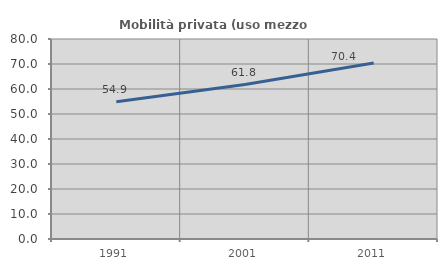
| Category | Mobilità privata (uso mezzo privato) |
|---|---|
| 1991.0 | 54.933 |
| 2001.0 | 61.78 |
| 2011.0 | 70.398 |